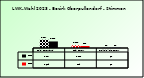
| Category | 2018 | 2023 |
|---|---|---|
| Bgld. Bauernbund | 3307 | 2619 |
| SPÖ Bauern | 1102 | 809 |
| Freiheitliche Bauern | 61 | 62 |